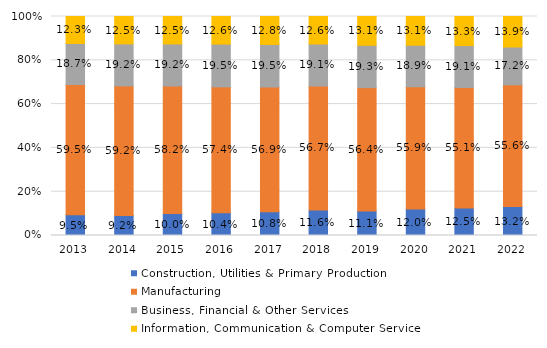
| Category | Construction, Utilities & Primary Production  | Manufacturing  | Business, Financial & Other Services | Information, Communication & Computer Services |
|---|---|---|---|---|
| 2013.0 | 0.095 | 0.595 | 0.187 | 0.123 |
| 2014.0 | 0.092 | 0.592 | 0.192 | 0.125 |
| 2015.0 | 0.1 | 0.582 | 0.192 | 0.125 |
| 2016.0 | 0.104 | 0.574 | 0.195 | 0.126 |
| 2017.0 | 0.108 | 0.569 | 0.195 | 0.128 |
| 2018.0 | 0.116 | 0.567 | 0.191 | 0.126 |
| 2019.0 | 0.111 | 0.564 | 0.193 | 0.131 |
| 2020.0 | 0.12 | 0.559 | 0.189 | 0.131 |
| 2021.0 | 0.125 | 0.551 | 0.191 | 0.133 |
| 2022.0 | 0.132 | 0.556 | 0.172 | 0.139 |